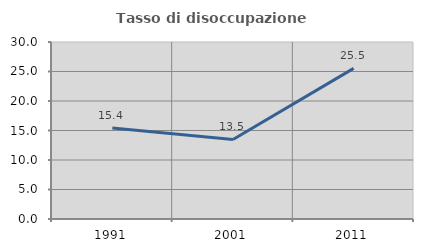
| Category | Tasso di disoccupazione giovanile  |
|---|---|
| 1991.0 | 15.433 |
| 2001.0 | 13.488 |
| 2011.0 | 25.532 |